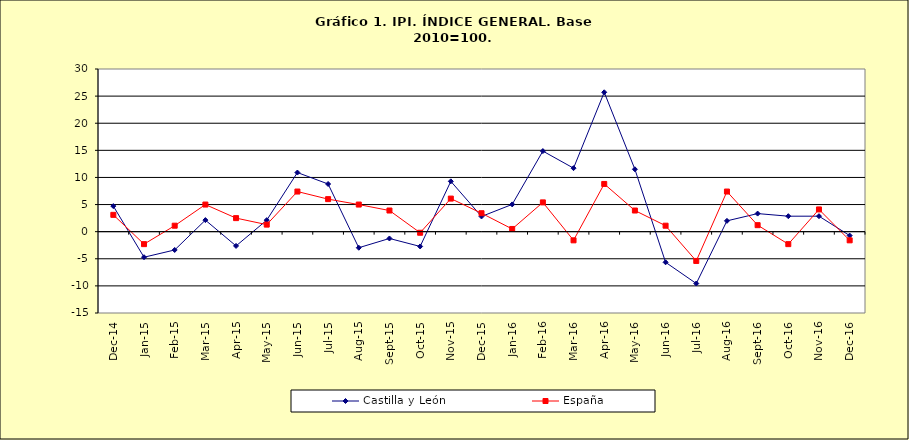
| Category | Castilla y León | España |
|---|---|---|
| 2014-12-02 | 4.714 | 3.1 |
| 2015-01-01 | -4.714 | -2.3 |
| 2015-02-02 | -3.374 | 1.1 |
| 2015-03-03 | 2.131 | 5 |
| 2015-04-04 | -2.63 | 2.5 |
| 2015-05-05 | 2.125 | 1.3 |
| 2015-06-01 | 10.902 | 7.4 |
| 2015-07-02 | 8.793 | 6 |
| 2015-08-03 | -2.962 | 5 |
| 2015-09-04 | -1.256 | 3.9 |
| 2015-10-05 | -2.727 | -0.2 |
| 2015-11-06 | 9.284 | 6.1 |
| 2015-12-07 | 2.805 | 3.4 |
| 2016-01-01 | 5.027 | 0.5 |
| 2016-02-02 | 14.862 | 5.4 |
| 2016-03-03 | 11.716 | -1.6 |
| 2016-04-04 | 25.706 | 8.8 |
| 2016-05-05 | 11.507 | 3.9 |
| 2016-06-06 | -5.65 | 1.1 |
| 2016-07-07 | -9.559 | -5.4 |
| 2016-08-08 | 1.995 | 7.4 |
| 2016-09-09 | 3.335 | 1.2 |
| 2016-10-10 | 2.852 | -2.3 |
| 2016-11-11 | 2.857 | 4.1 |
| 2016-12-12 | -0.722 | -1.6 |